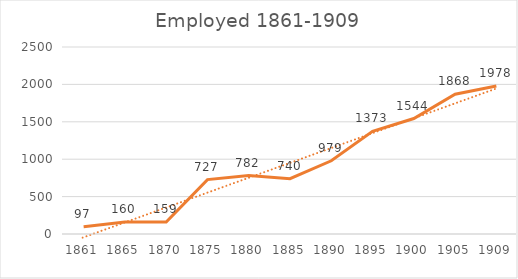
| Category | Series 1 |
|---|---|
| 1861.0 | 97 |
| 1865.0 | 160 |
| 1870.0 | 159 |
| 1875.0 | 727 |
| 1880.0 | 782 |
| 1885.0 | 740 |
| 1890.0 | 979 |
| 1895.0 | 1373 |
| 1900.0 | 1544 |
| 1905.0 | 1868 |
| 1909.0 | 1978 |